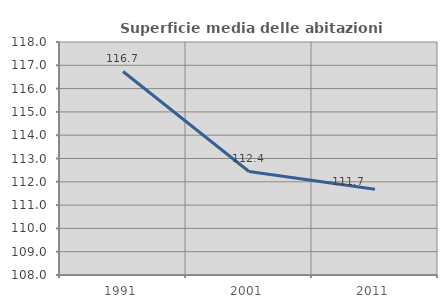
| Category | Superficie media delle abitazioni occupate |
|---|---|
| 1991.0 | 116.735 |
| 2001.0 | 112.443 |
| 2011.0 | 111.683 |